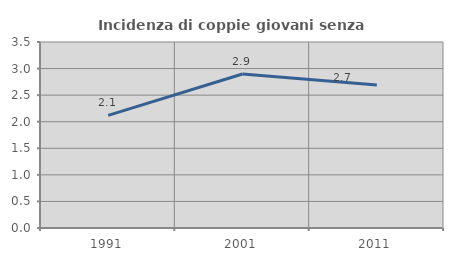
| Category | Incidenza di coppie giovani senza figli |
|---|---|
| 1991.0 | 2.12 |
| 2001.0 | 2.899 |
| 2011.0 | 2.692 |